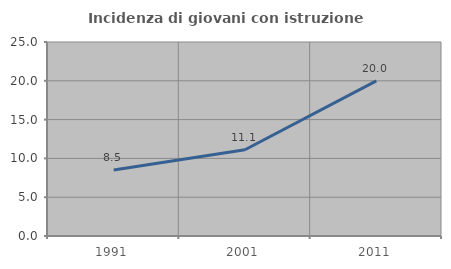
| Category | Incidenza di giovani con istruzione universitaria |
|---|---|
| 1991.0 | 8.511 |
| 2001.0 | 11.111 |
| 2011.0 | 20 |